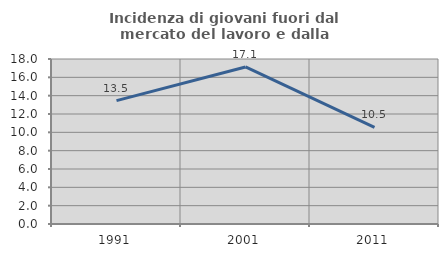
| Category | Incidenza di giovani fuori dal mercato del lavoro e dalla formazione  |
|---|---|
| 1991.0 | 13.459 |
| 2001.0 | 17.133 |
| 2011.0 | 10.545 |